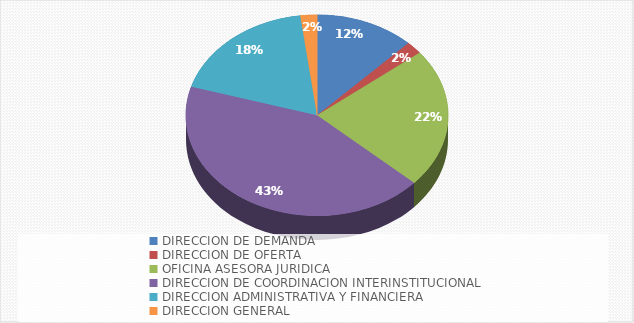
| Category | Cantidad de solicitudes |
|---|---|
| DIRECCION DE DEMANDA | 6 |
| DIRECCION DE OFERTA | 1 |
| OFICINA ASESORA JURIDICA | 11 |
| DIRECCION DE COORDINACION INTERINSTITUCIONAL | 21 |
| DIRECCION ADMINISTRATIVA Y FINANCIERA | 9 |
| DIRECCION GENERAL | 1 |